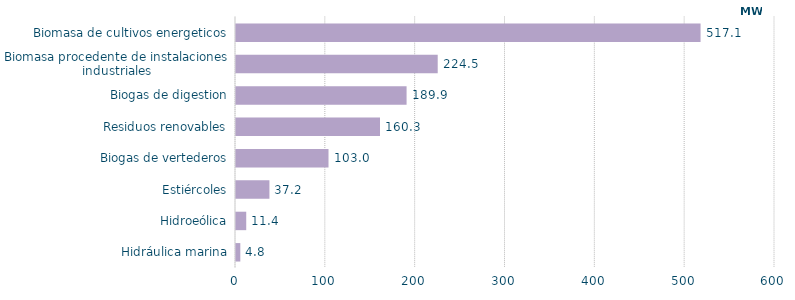
| Category | Series 0 |
|---|---|
| Hidráulica marina | 4.796 |
| Hidroeólica | 11.39 |
| Estiércoles | 37.2 |
| Biogas de vertederos | 102.984 |
| Residuos renovables | 160.3 |
| Biogas de digestion | 189.894 |
| Biomasa procedente de instalaciones industriales | 224.537 |
| Biomasa de cultivos energeticos | 517.127 |